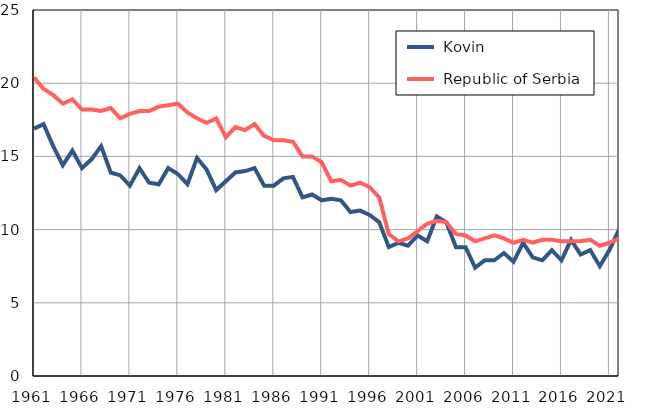
| Category |  Kovin |  Republic of Serbia |
|---|---|---|
| 1961.0 | 16.9 | 20.4 |
| 1962.0 | 17.2 | 19.6 |
| 1963.0 | 15.7 | 19.2 |
| 1964.0 | 14.4 | 18.6 |
| 1965.0 | 15.4 | 18.9 |
| 1966.0 | 14.2 | 18.2 |
| 1967.0 | 14.8 | 18.2 |
| 1968.0 | 15.7 | 18.1 |
| 1969.0 | 13.9 | 18.3 |
| 1970.0 | 13.7 | 17.6 |
| 1971.0 | 13 | 17.9 |
| 1972.0 | 14.2 | 18.1 |
| 1973.0 | 13.2 | 18.1 |
| 1974.0 | 13.1 | 18.4 |
| 1975.0 | 14.2 | 18.5 |
| 1976.0 | 13.8 | 18.6 |
| 1977.0 | 13.1 | 18 |
| 1978.0 | 14.9 | 17.6 |
| 1979.0 | 14.1 | 17.3 |
| 1980.0 | 12.7 | 17.6 |
| 1981.0 | 13.3 | 16.3 |
| 1982.0 | 13.9 | 17 |
| 1983.0 | 14 | 16.8 |
| 1984.0 | 14.2 | 17.2 |
| 1985.0 | 13 | 16.4 |
| 1986.0 | 13 | 16.1 |
| 1987.0 | 13.5 | 16.1 |
| 1988.0 | 13.6 | 16 |
| 1989.0 | 12.2 | 15 |
| 1990.0 | 12.4 | 15 |
| 1991.0 | 12 | 14.6 |
| 1992.0 | 12.1 | 13.3 |
| 1993.0 | 12 | 13.4 |
| 1994.0 | 11.2 | 13 |
| 1995.0 | 11.3 | 13.2 |
| 1996.0 | 11 | 12.9 |
| 1997.0 | 10.5 | 12.2 |
| 1998.0 | 8.8 | 9.7 |
| 1999.0 | 9.1 | 9.2 |
| 2000.0 | 8.9 | 9.4 |
| 2001.0 | 9.6 | 9.9 |
| 2002.0 | 9.2 | 10.4 |
| 2003.0 | 10.9 | 10.6 |
| 2004.0 | 10.5 | 10.5 |
| 2005.0 | 8.8 | 9.7 |
| 2006.0 | 8.8 | 9.6 |
| 2007.0 | 7.4 | 9.2 |
| 2008.0 | 7.9 | 9.4 |
| 2009.0 | 7.9 | 9.6 |
| 2010.0 | 8.4 | 9.4 |
| 2011.0 | 7.8 | 9.1 |
| 2012.0 | 9.1 | 9.3 |
| 2013.0 | 8.1 | 9.1 |
| 2014.0 | 7.9 | 9.3 |
| 2015.0 | 8.6 | 9.3 |
| 2016.0 | 7.9 | 9.2 |
| 2017.0 | 9.3 | 9.2 |
| 2018.0 | 8.3 | 9.2 |
| 2019.0 | 8.6 | 9.3 |
| 2020.0 | 7.5 | 8.9 |
| 2021.0 | 8.6 | 9.1 |
| 2022.0 | 10 | 9.4 |